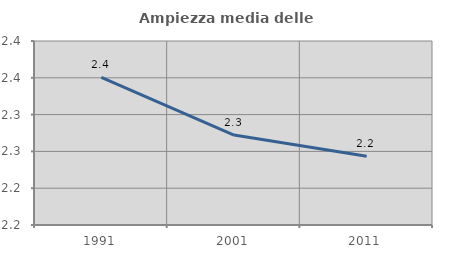
| Category | Ampiezza media delle famiglie |
|---|---|
| 1991.0 | 2.35 |
| 2001.0 | 2.272 |
| 2011.0 | 2.244 |